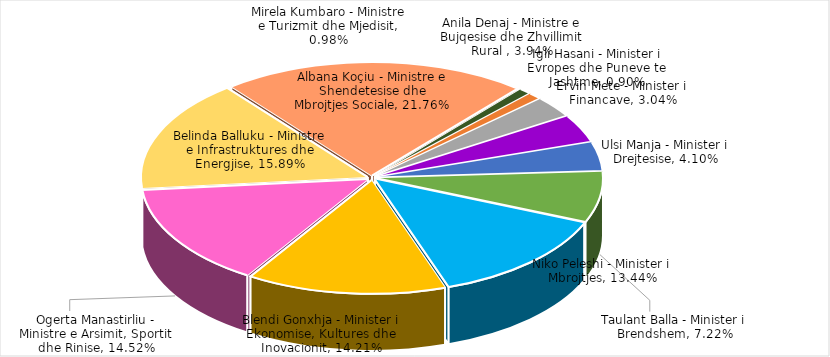
| Category | Pesha Portofol Ministror kundrejt Total Portofole Ministrore (në %) |
|---|---|
| Igli Hasani - Minister i Evropes dhe Puneve te Jashtme | 0.009 |
| Mirela Kumbaro - Ministre e Turizmit dhe Mjedisit | 0.01 |
| Ervin Mete - Minister i Financave | 0.03 |
| Anila Denaj - Ministre e Bujqesise dhe Zhvillimit Rural  | 0.039 |
| Ulsi Manja - Minister i Drejtesise | 0.041 |
| Taulant Balla - Minister i Brendshem | 0.072 |
| Niko Peleshi - Minister i Mbrojtjes | 0.134 |
| Blendi Gonxhja - Minister i Ekonomise, Kultures dhe Inovacionit | 0.142 |
| Ogerta Manastirliu - Ministre e Arsimit, Sportit dhe Rinise | 0.145 |
| Belinda Balluku - Ministre e Infrastruktures dhe Energjise | 0.159 |
| Albana Koçiu - Ministre e Shendetesise dhe Mbrojtjes Sociale | 0.218 |